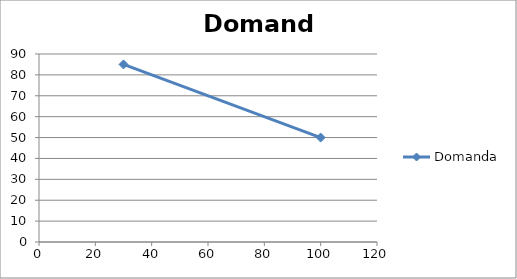
| Category | Domanda |
|---|---|
| 30.0 | 85 |
| 100.0 | 50 |